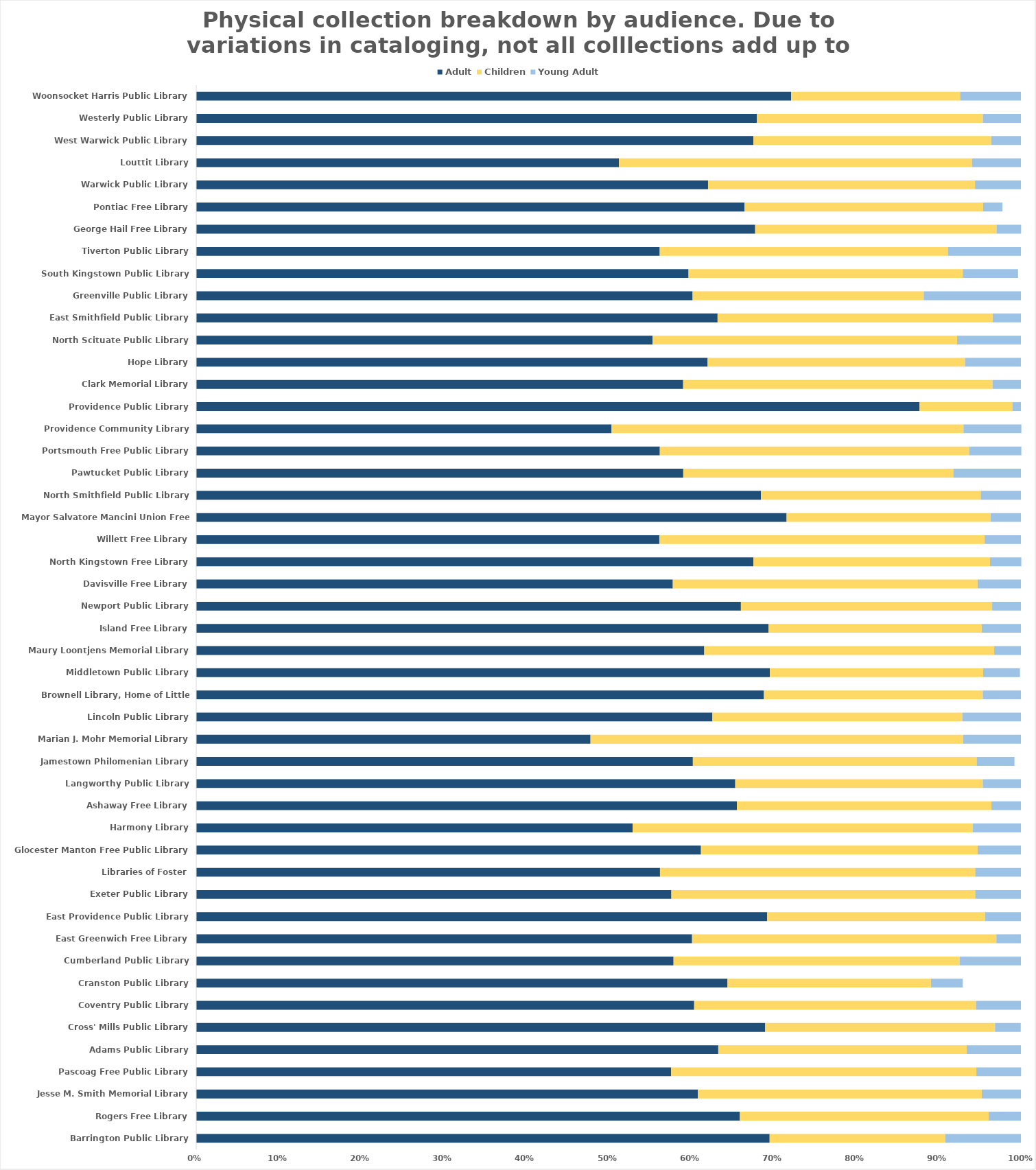
| Category | Adult | Children | Young Adult |
|---|---|---|---|
| Barrington Public Library | 0.695 | 0.213 | 0.092 |
| Rogers Free Library | 0.659 | 0.302 | 0.039 |
| Jesse M. Smith Memorial Library | 0.608 | 0.344 | 0.047 |
| Pascoag Free Public Library | 0.576 | 0.37 | 0.054 |
| Adams Public Library | 0.633 | 0.301 | 0.066 |
| Cross' Mills Public Library | 0.69 | 0.279 | 0.031 |
| Coventry Public Library | 0.604 | 0.342 | 0.054 |
| Cranston Public Library | 0.644 | 0.247 | 0.039 |
| Cumberland Public Library | 0.579 | 0.347 | 0.074 |
| East Greenwich Free Library | 0.601 | 0.369 | 0.03 |
| East Providence Public Library | 0.692 | 0.264 | 0.043 |
| Exeter Public Library | 0.576 | 0.368 | 0.055 |
| Libraries of Foster | 0.562 | 0.382 | 0.055 |
| Glocester Manton Free Public Library | 0.612 | 0.336 | 0.052 |
| Harmony Library | 0.529 | 0.413 | 0.058 |
| Ashaway Free Library | 0.656 | 0.309 | 0.036 |
| Langworthy Public Library | 0.654 | 0.3 | 0.046 |
| Jamestown Philomenian Library | 0.602 | 0.344 | 0.046 |
| Marian J. Mohr Memorial Library | 0.478 | 0.452 | 0.07 |
| Lincoln Public Library | 0.626 | 0.303 | 0.071 |
| Brownell Library, Home of Little Compton | 0.688 | 0.265 | 0.046 |
| Middletown Public Library | 0.696 | 0.259 | 0.045 |
| Maury Loontjens Memorial Library | 0.616 | 0.352 | 0.032 |
| Island Free Library | 0.694 | 0.258 | 0.048 |
| Newport Public Library | 0.66 | 0.305 | 0.035 |
| Davisville Free Library | 0.578 | 0.37 | 0.053 |
| North Kingstown Free Library | 0.676 | 0.287 | 0.038 |
| Willett Free Library | 0.562 | 0.395 | 0.044 |
| Mayor Salvatore Mancini Union Free Library | 0.716 | 0.247 | 0.037 |
| North Smithfield Public Library | 0.685 | 0.267 | 0.049 |
| Pawtucket Public Library | 0.591 | 0.327 | 0.082 |
| Portsmouth Free Public Library | 0.562 | 0.375 | 0.063 |
| Providence Community Library | 0.504 | 0.427 | 0.07 |
| Providence Public Library | 0.877 | 0.112 | 0.01 |
| Clark Memorial Library | 0.59 | 0.375 | 0.034 |
| Hope Library | 0.62 | 0.312 | 0.068 |
| North Scituate Public Library | 0.553 | 0.369 | 0.077 |
| East Smithfield Public Library | 0.632 | 0.334 | 0.034 |
| Greenville Public Library | 0.602 | 0.28 | 0.118 |
| South Kingstown Public Library | 0.597 | 0.333 | 0.067 |
| Tiverton Public Library | 0.562 | 0.35 | 0.088 |
| George Hail Free Library | 0.678 | 0.293 | 0.03 |
| Pontiac Free Library | 0.665 | 0.289 | 0.023 |
| Warwick Public Library | 0.621 | 0.324 | 0.056 |
| Louttit Library | 0.513 | 0.428 | 0.059 |
| West Warwick Public Library | 0.676 | 0.288 | 0.036 |
| Westerly Public Library | 0.68 | 0.274 | 0.046 |
| Woonsocket Harris Public Library | 0.721 | 0.205 | 0.074 |